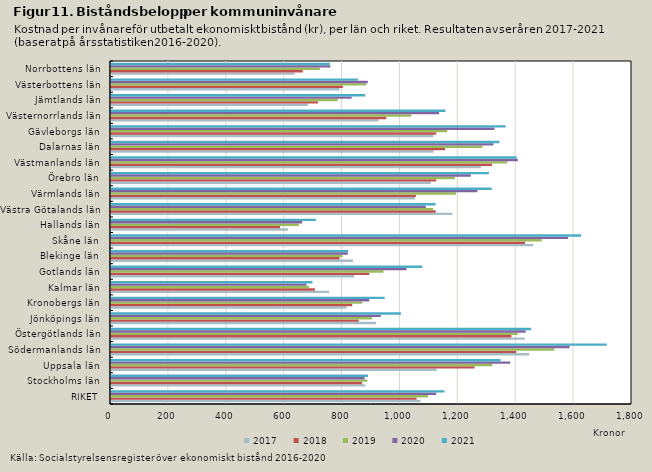
| Category | 2017 | 2018 | 2019 | 2020 | 2021 |
|---|---|---|---|---|---|
| RIKET | 1069 | 1055.614 | 1095.405 | 1123.414 | 1152.152 |
| Stockholms län | 878.703 | 867.272 | 885.503 | 875.874 | 887.994 |
| Uppsala län | 1125.685 | 1255.723 | 1317.84 | 1379.119 | 1346.149 |
| Södermanlands län | 1445.08 | 1400.05 | 1531.723 | 1584.483 | 1712.385 |
| Östergötlands län | 1429.207 | 1383.5 | 1405.319 | 1432.572 | 1451.732 |
| Jönköpings län | 916.271 | 855.805 | 901.591 | 931.995 | 1001.766 |
| Kronobergs län | 814.498 | 833.544 | 868.004 | 892.036 | 945.588 |
| Kalmar län | 753.679 | 704.407 | 684.54 | 675.381 | 696.04 |
| Gotlands län | 840.406 | 892.617 | 941.215 | 1021.002 | 1074.974 |
| Blekinge län | 835.803 | 789.401 | 800.026 | 817.986 | 819.74 |
| Skåne län | 1459.151 | 1430.428 | 1488.422 | 1579.516 | 1624.421 |
| Hallands län | 611.897 | 583.747 | 649.352 | 660.478 | 707.818 |
| Västra Götalands län | 1179.144 | 1121.555 | 1112.797 | 1087.586 | 1121.555 |
| Värmlands län | 1050.176 | 1053.277 | 1191.722 | 1266.233 | 1315.505 |
| Örebro län | 1104.88 | 1123.596 | 1187.821 | 1243.1 | 1305.772 |
| Västmanlands län | 1278.143 | 1316.429 | 1369.567 | 1405.492 | 1400.96 |
| Dalarnas län | 1114.155 | 1154.19 | 1283.573 | 1321.279 | 1341.986 |
| Gävleborgs län | 1114.139 | 1123.599 | 1161.661 | 1324.81 | 1363.352 |
| Västernorrlands län | 924.339 | 950.995 | 1037.248 | 1133.619 | 1155.749 |
| Jämtlands län | 679.827 | 715.666 | 783.626 | 831.585 | 878.223 |
| Västerbottens län | 790.022 | 801.222 | 882.031 | 887.107 | 852.958 |
| Norrbottens län | 634.508 | 662.512 | 721.415 | 757.969 | 756.012 |